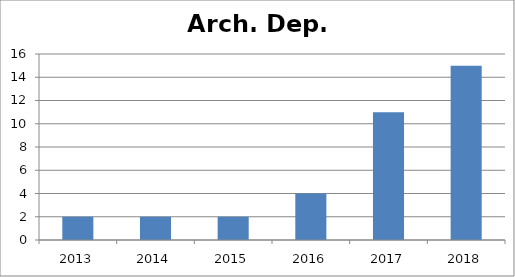
| Category | Arch. Dep. Publications |
|---|---|
| 0 | 2 |
| 1 | 2 |
| 2 | 2 |
| 3 | 4 |
| 4 | 11 |
| 5 | 15 |